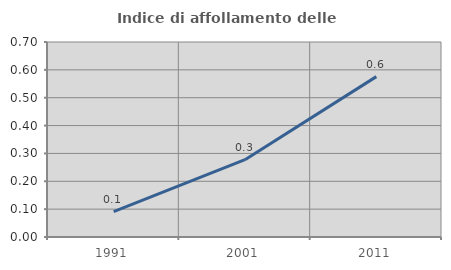
| Category | Indice di affollamento delle abitazioni  |
|---|---|
| 1991.0 | 0.091 |
| 2001.0 | 0.278 |
| 2011.0 | 0.576 |